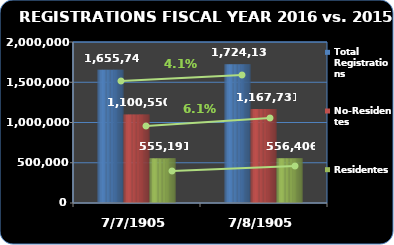
| Category | Total Registrations | No-Residentes | Residentes |
|---|---|---|---|
| 2016.0 | 1724137 | 1167731 | 556406 |
| 2015.0 | 1655741 | 1100550 | 555191 |